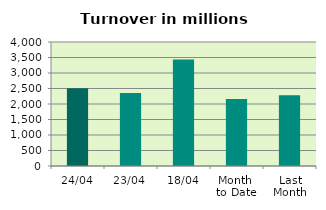
| Category | Series 0 |
|---|---|
| 24/04 | 2504.204 |
| 23/04 | 2357.058 |
| 18/04 | 3432.021 |
| Month 
to Date | 2164.317 |
| Last
Month | 2286.259 |